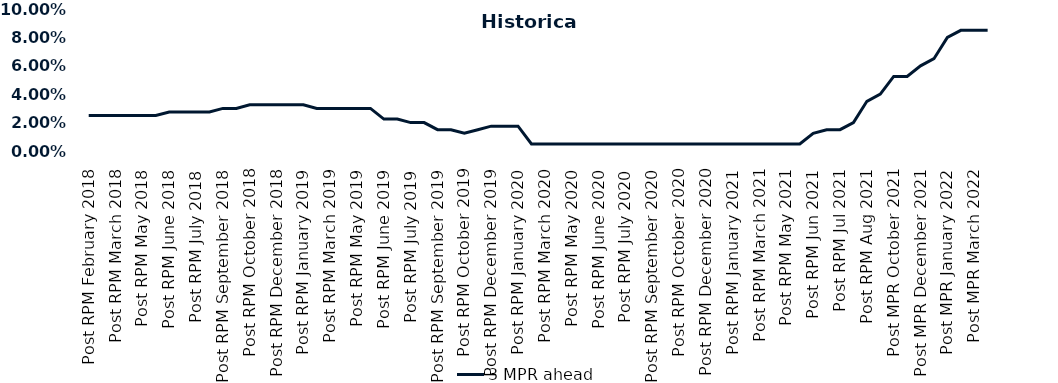
| Category | 3 MPR ahead |
|---|---|
| Post RPM February 2018 | 0.025 |
| Pre RPM March 2018 | 0.025 |
| Post RPM March 2018 | 0.025 |
| Pre RPM May 2018 | 0.025 |
| Post RPM May 2018 | 0.025 |
| Pre RPM June 2018 | 0.025 |
| Post RPM June 2018 | 0.028 |
| Pre RPM July 2018 | 0.028 |
| Post RPM July 2018 | 0.028 |
| Pre RPM September 2018 | 0.028 |
| Post RPM September 2018 | 0.03 |
| Pre RPM October 2018 | 0.03 |
| Post RPM October 2018 | 0.032 |
| Pre RPM December 2018 | 0.032 |
| Post RPM December 2018 | 0.032 |
| Pre RPM January 2019 | 0.032 |
| Post RPM January 2019 | 0.032 |
| Pre RPM March 2019 | 0.03 |
| Post RPM March 2019 | 0.03 |
| Pre RPM May 2019 | 0.03 |
| Post RPM May 2019 | 0.03 |
| Pre RPM June 2019 | 0.03 |
| Post RPM June 2019 | 0.022 |
| Pre RPM July 2019 | 0.022 |
| Post RPM July 2019 | 0.02 |
| Pre RPM September 2019 | 0.02 |
| Post RPM September 2019 | 0.015 |
| Pre RPM October 2019 | 0.015 |
| Post RPM October 2019 | 0.012 |
| Pre RPM December 2019 | 0.015 |
| Post RPM December 2019 | 0.018 |
| Pre RPM January 2020 | 0.018 |
| Post RPM January 2020 | 0.018 |
| Pre RPM March 2020 | 0.005 |
| Post RPM March 2020 | 0.005 |
| Pre RPM May 2020 | 0.005 |
| Post RPM May 2020 | 0.005 |
| Pre RPM June 2020 | 0.005 |
| Post RPM June 2020 | 0.005 |
| Pre RPM July 2020 | 0.005 |
| Post RPM July 2020 | 0.005 |
| Pre RPM September 2020 | 0.005 |
| Post RPM September 2020 | 0.005 |
| Pre RPM October 2020 | 0.005 |
| Post RPM October 2020 | 0.005 |
| Pre RPM December 2020 | 0.005 |
|  Post RPM December 2020 | 0.005 |
| Pre RPM January 2021 | 0.005 |
| Post RPM January 2021 | 0.005 |
|  Pre RPM March 2021 | 0.005 |
|  Post RPM March 2021 | 0.005 |
|  Pre RPM May 2021 | 0.005 |
|  Post RPM May 2021 | 0.005 |
|  Pre RPM Jun 2021 | 0.005 |
|   Post RPM Jun 2021 | 0.012 |
| Pre RPM Jul 2021 | 0.015 |
|  Post RPM Jul 2021 | 0.015 |
| Pre RPM Aug 2021 | 0.02 |
|  Post RPM Aug 2021 | 0.035 |
| Pre MPR October 2021 | 0.04 |
| Post MPR October 2021 | 0.052 |
| Pre MPR December 2021 | 0.052 |
| Post MPR December 2021 | 0.06 |
| Pre MPR January 2022 | 0.065 |
| Post MPR January 2022 | 0.08 |
| Pre MPR March 2022 | 0.085 |
| Post MPR March 2022 | 0.085 |
| Pre MPR May 2022 | 0.085 |